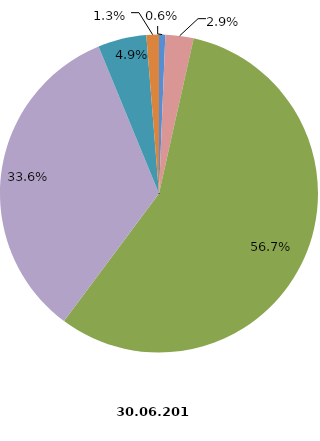
| Category | Anzahl Betriebe 2017 |
|---|---|
| 1 - 4 Beschäftigte | 4 |
| 5 - 9 Beschäftigte | 18 |
| 10 - 19 Beschäftigte | 356 |
| 20 - 49 Beschäftigte | 211 |
| 50 - 99 Beschäftigte | 31 |
| 100 und mehr Beschäftigte | 8 |